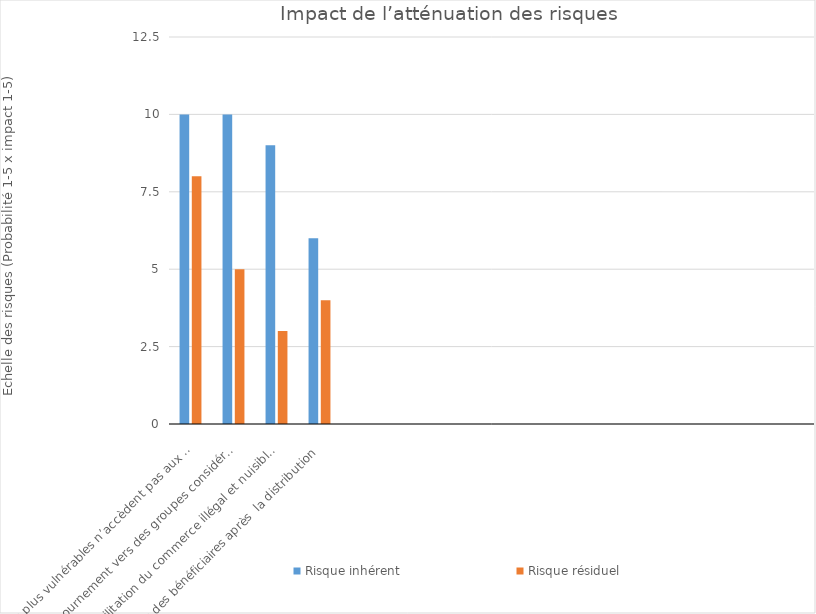
| Category | Risque inhérent | Risque résiduel |
|---|---|---|
| Les plus vulnérables n’accèdent pas aux services | 10 | 8 |
| Détournement vers des groupes considérés comme terroristes | 10 | 5 |
| Facilitation du commerce illégal et nuisible  | 9 | 3 |
| Vols des bénéficiaires après  la distribution | 6 | 4 |